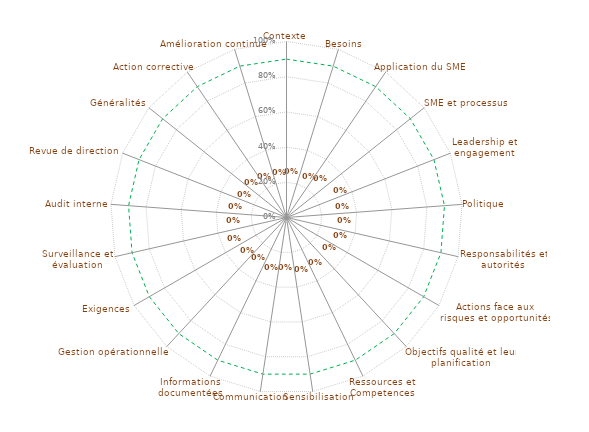
| Category | 90% | résultats |
|---|---|---|
| 0 | 0.9 | 0 |
| 1 | 0.9 | 0 |
| 2 | 0.9 | 0 |
| 3 | 0.9 | 0 |
| 4 | 0.9 | 0 |
| 5 | 0.9 | 0 |
| 6 | 0.9 | 0 |
| 7 | 0.9 | 0 |
| 8 | 0.9 | 0 |
| 9 | 0.9 | 0 |
| 10 | 0.9 | 0 |
| 11 | 0.9 | 0 |
| 12 | 0.9 | 0 |
| 13 | 0.9 | 0 |
| 14 | 0.9 | 0 |
| 15 | 0.9 | 0 |
| 16 | 0.9 | 0 |
| 17 | 0.9 | 0 |
| 18 | 0.9 | 0 |
| 19 | 0.9 | 0 |
| 20 | 0.9 | 0 |